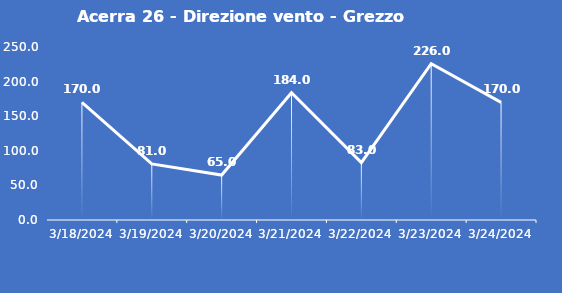
| Category | Acerra 26 - Direzione vento - Grezzo (°N) |
|---|---|
| 3/18/24 | 170 |
| 3/19/24 | 81 |
| 3/20/24 | 65 |
| 3/21/24 | 184 |
| 3/22/24 | 83 |
| 3/23/24 | 226 |
| 3/24/24 | 170 |